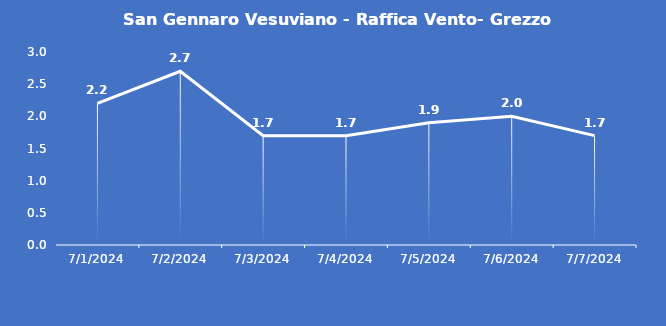
| Category | San Gennaro Vesuviano - Raffica Vento- Grezzo (m/s) |
|---|---|
| 7/1/24 | 2.2 |
| 7/2/24 | 2.7 |
| 7/3/24 | 1.7 |
| 7/4/24 | 1.7 |
| 7/5/24 | 1.9 |
| 7/6/24 | 2 |
| 7/7/24 | 1.7 |